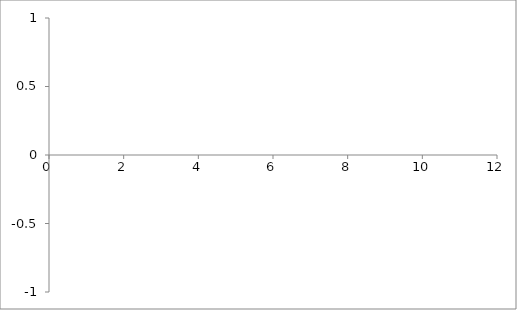
| Category | Series 0 |
|---|---|
| 0.0 | 0 |
| 0.0 | 0 |
| 0.0 | 0 |
| 0.0 | 0 |
| 0.0 | 0 |
| 0.0 | 0 |
| 0.0 | 0 |
| 0.0 | 0 |
| 0.0 | 0 |
| 0.0 | 0 |
| 0.0 | 0 |
| 0.0 | 0 |
| 0.0 | 0 |
| 0.0 | 0 |
| 0.0 | 0 |
| 0.0 | 0 |
| 0.0 | 0 |
| 0.0 | 0 |
| 0.0 | 0 |
| 0.0 | 0 |
| 0.0 | 0 |
| 0.0 | 0 |
| 0.0 | 0 |
| 0.0 | 0 |
| 0.0 | 0 |
| 0.0 | 0 |
| 0.0 | 0 |
| 0.0 | 0 |
| 0.0 | 0 |
| 0.0 | 0 |
| 0.0 | 0 |
| 0.0 | 0 |
| 0.0 | 0 |
| 0.0 | 0 |
| 0.0 | 0 |
| 0.0 | 0 |
| 0.0 | 0 |
| 0.0 | 0 |
| 0.0 | 0 |
| 0.0 | 0 |
| 0.0 | 0 |
| 0.0 | 0 |
| 0.0 | 0 |
| 0.0 | 0 |
| 0.0 | 0 |
| 0.0 | 0 |
| 0.0 | 0 |
| 0.0 | 0 |
| 0.0 | 0 |
| 0.0 | 0 |
| 0.0 | 0 |
| 0.0 | 0 |
| 0.0 | 0 |
| 0.0 | 0 |
| 0.0 | 0 |
| 0.0 | 0 |
| 0.0 | 0 |
| 0.0 | 0 |
| 0.0 | 0 |
| 0.0 | 0 |
| 0.0 | 0 |
| 0.0 | 0 |
| 0.0 | 0 |
| 0.0 | 0 |
| 0.0 | 0 |
| 0.0 | 0 |
| 0.0 | 0 |
| 0.0 | 0 |
| 0.0 | 0 |
| 0.0 | 0 |
| 0.0 | 0 |
| 0.0 | 0 |
| 0.0 | 0 |
| 0.0 | 0 |
| 0.0 | 0 |
| 0.0 | 0 |
| 0.0 | 0 |
| 0.0 | 0 |
| 0.0 | 0 |
| 0.0 | 0 |
| 0.0 | 0 |
| 0.0 | 0 |
| 0.0 | 0 |
| 0.0 | 0 |
| 0.0 | 0 |
| 0.0 | 0 |
| 0.0 | 0 |
| 0.0 | 0 |
| 0.0 | 0 |
| 0.0 | 0 |
| 0.0 | 0 |
| 0.0 | 0 |
| 0.0 | 0 |
| 0.0 | 0 |
| 0.0 | 0 |
| 0.0 | 0 |
| 0.0 | 0 |
| 0.0 | 0 |
| 0.0 | 0 |
| 0.0 | 0 |
| 0.0 | 0 |
| 0.0 | 0 |
| 0.0 | 0 |
| 0.0 | 0 |
| 0.0 | 0 |
| 0.0 | 0 |
| 0.0 | 0 |
| 0.0 | 0 |
| 0.0 | 0 |
| 0.0 | 0 |
| 0.0 | 0 |
| 0.0 | 0 |
| 0.0 | 0 |
| 0.0 | 0 |
| 0.0 | 0 |
| 0.0 | 0 |
| 0.0 | 0 |
| 0.0 | 0 |
| 0.0 | 0 |
| 0.0 | 0 |
| 0.0 | 0 |
| 0.0 | 0 |
| 0.0 | 0 |
| 0.0 | 0 |
| 0.0 | 0 |
| 0.0 | 0 |
| 0.0 | 0 |
| 0.0 | 0 |
| 0.0 | 0 |
| 0.0 | 0 |
| 0.0 | 0 |
| 0.0 | 0 |
| 0.0 | 0 |
| 0.0 | 0 |
| 0.0 | 0 |
| 0.0 | 0 |
| 0.0 | 0 |
| 0.0 | 0 |
| 0.0 | 0 |
| 0.0 | 0 |
| 0.0 | 0 |
| 0.0 | 0 |
| 0.0 | 0 |
| 0.0 | 0 |
| 0.0 | 0 |
| 0.0 | 0 |
| 0.0 | 0 |
| 0.0 | 0 |
| 0.0 | 0 |
| 0.0 | 0 |
| 0.0 | 0 |
| 0.0 | 0 |
| 0.0 | 0 |
| 0.0 | 0 |
| 0.0 | 0 |
| 0.0 | 0 |
| 0.0 | 0 |
| 0.0 | 0 |
| 0.0 | 0 |
| 0.0 | 0 |
| 0.0 | 0 |
| 0.0 | 0 |
| 0.0 | 0 |
| 0.0 | 0 |
| 0.0 | 0 |
| 0.0 | 0 |
| 0.0 | 0 |
| 0.0 | 0 |
| 0.0 | 0 |
| 0.0 | 0 |
| 0.0 | 0 |
| 0.0 | 0 |
| 0.0 | 0 |
| 0.0 | 0 |
| 0.0 | 0 |
| 0.0 | 0 |
| 0.0 | 0 |
| 0.0 | 0 |
| 0.0 | 0 |
| 0.0 | 0 |
| 0.0 | 0 |
| 0.0 | 0 |
| 0.0 | 0 |
| 0.0 | 0 |
| 0.0 | 0 |
| 0.0 | 0 |
| 0.0 | 0 |
| 0.0 | 0 |
| 0.0 | 0 |
| 0.0 | 0 |
| 0.0 | 0 |
| 0.0 | 0 |
| 0.0 | 0 |
| 0.0 | 0 |
| 0.0 | 0 |
| 0.0 | 0 |
| 0.0 | 0 |
| 0.0 | 0 |
| 0.0 | 0 |
| 0.0 | 0 |
| 0.0 | 0 |
| 0.0 | 0 |
| 0.0 | 0 |
| 0.0 | 0 |
| 0.0 | 0 |
| 0.0 | 0 |
| 0.0 | 0 |
| 0.0 | 0 |
| 0.0 | 0 |
| 0.0 | 0 |
| 0.0 | 0 |
| 0.0 | 0 |
| 0.0 | 0 |
| 0.0 | 0 |
| 0.0 | 0 |
| 0.0 | 0 |
| 0.0 | 0 |
| 0.0 | 0 |
| 0.0 | 0 |
| 0.0 | 0 |
| 0.0 | 0 |
| 0.0 | 0 |
| 0.0 | 0 |
| 0.0 | 0 |
| 0.0 | 0 |
| 0.0 | 0 |
| 0.0 | 0 |
| 0.0 | 0 |
| 0.0 | 0 |
| 0.0 | 0 |
| 0.0 | 0 |
| 0.0 | 0 |
| 0.0 | 0 |
| 0.0 | 0 |
| 0.0 | 0 |
| 0.0 | 0 |
| 0.0 | 0 |
| 0.0 | 0 |
| 0.0 | 0 |
| 0.0 | 0 |
| 0.0 | 0 |
| 0.0 | 0 |
| 0.0 | 0 |
| 0.0 | 0 |
| 0.0 | 0 |
| 0.0 | 0 |
| 0.0 | 0 |
| 0.0 | 0 |
| 0.0 | 0 |
| 0.0 | 0 |
| 0.0 | 0 |
| 0.0 | 0 |
| 0.0 | 0 |
| 0.0 | 0 |
| 0.0 | 0 |
| 0.0 | 0 |
| 0.0 | 0 |
| 0.0 | 0 |
| 0.0 | 0 |
| 0.0 | 0 |
| 0.0 | 0 |
| 0.0 | 0 |
| 0.0 | 0 |
| 0.0 | 0 |
| 0.0 | 0 |
| 0.0 | 0 |
| 0.0 | 0 |
| 0.0 | 0 |
| 0.0 | 0 |
| 0.0 | 0 |
| 0.0 | 0 |
| 0.0 | 0 |
| 0.0 | 0 |
| 0.0 | 0 |
| 0.0 | 0 |
| 0.0 | 0 |
| 0.0 | 0 |
| 0.0 | 0 |
| 0.0 | 0 |
| 0.0 | 0 |
| 0.0 | 0 |
| 0.0 | 0 |
| 0.0 | 0 |
| 0.0 | 0 |
| 0.0 | 0 |
| 0.0 | 0 |
| 0.0 | 0 |
| 0.0 | 0 |
| 0.0 | 0 |
| 0.0 | 0 |
| 0.0 | 0 |
| 0.0 | 0 |
| 0.0 | 0 |
| 0.0 | 0 |
| 0.0 | 0 |
| 0.0 | 0 |
| 0.0 | 0 |
| 0.0 | 0 |
| 0.0 | 0 |
| 0.0 | 0 |
| 0.0 | 0 |
| 0.0 | 0 |
| 0.0 | 0 |
| 0.0 | 0 |
| 0.0 | 0 |
| 0.0 | 0 |
| 0.0 | 0 |
| 0.0 | 0 |
| 0.0 | 0 |
| 0.0 | 0 |